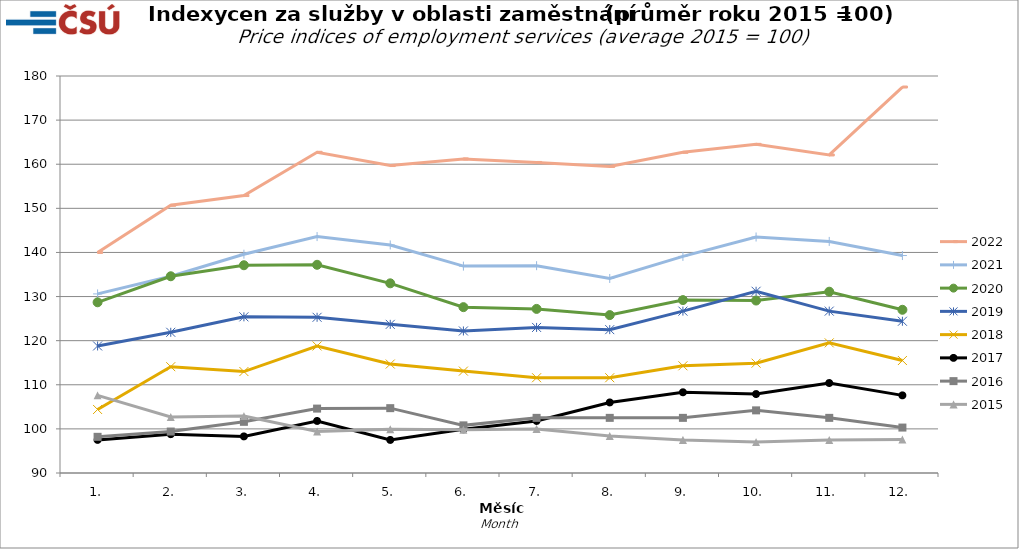
| Category | 2022 | 2021 | 2020 | 2019 | 2018 | 2017 | 2016 | 2015 |
|---|---|---|---|---|---|---|---|---|
| 1. | 140 | 130.6 | 128.7 | 118.8 | 104.4 | 97.5 | 98.2 | 107.6 |
| 2. | 150.7 | 134.6 | 134.6 | 121.9 | 114.1 | 98.8 | 99.4 | 102.7 |
| 3. | 152.9 | 139.6 | 137.1 | 125.4 | 113 | 98.3 | 101.6 | 102.9 |
| 4. | 162.7 | 143.6 | 137.2 | 125.3 | 118.8 | 101.8 | 104.6 | 99.4 |
| 5. | 159.7 | 141.7 | 133 | 123.7 | 114.7 | 97.5 | 104.7 | 99.9 |
| 6. | 161.2 | 136.9 | 127.6 | 122.2 | 113.1 | 99.9 | 100.8 | 99.8 |
| 7. | 160.4 | 137 | 127.2 | 123 | 111.6 | 101.8 | 102.5 | 100 |
| 8. | 159.5 | 134.1 | 125.8 | 122.5 | 111.6 | 106 | 102.5 | 98.4 |
| 9. | 162.7 | 139.1 | 129.2 | 126.7 | 114.3 | 108.3 | 102.5 | 97.5 |
| 10. | 164.5 | 143.5 | 129.1 | 131.2 | 114.9 | 107.9 | 104.2 | 97 |
| 11. | 162.1 | 142.5 | 131.1 | 126.7 | 119.5 | 110.4 | 102.5 | 97.5 |
| 12. | 177.5 | 139.3 | 127 | 124.4 | 115.5 | 107.6 | 100.3 | 97.6 |